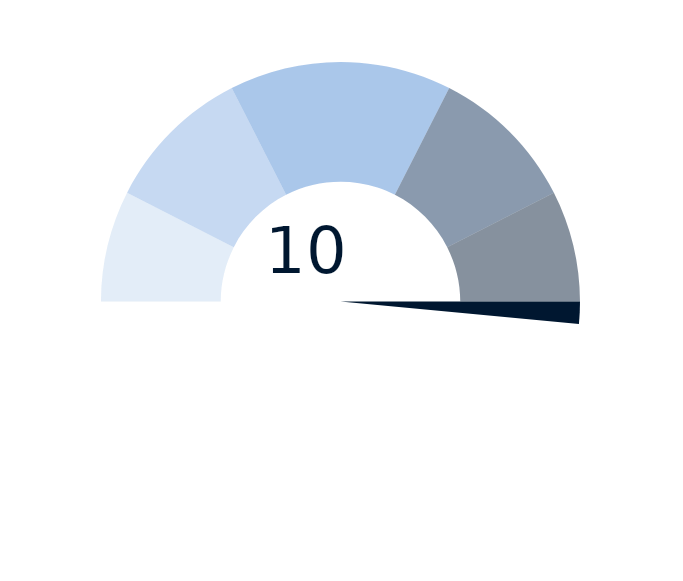
| Category | factor |
|---|---|
| 0 | 10 |
| 1 | 0.3 |
| 2 | 9.7 |